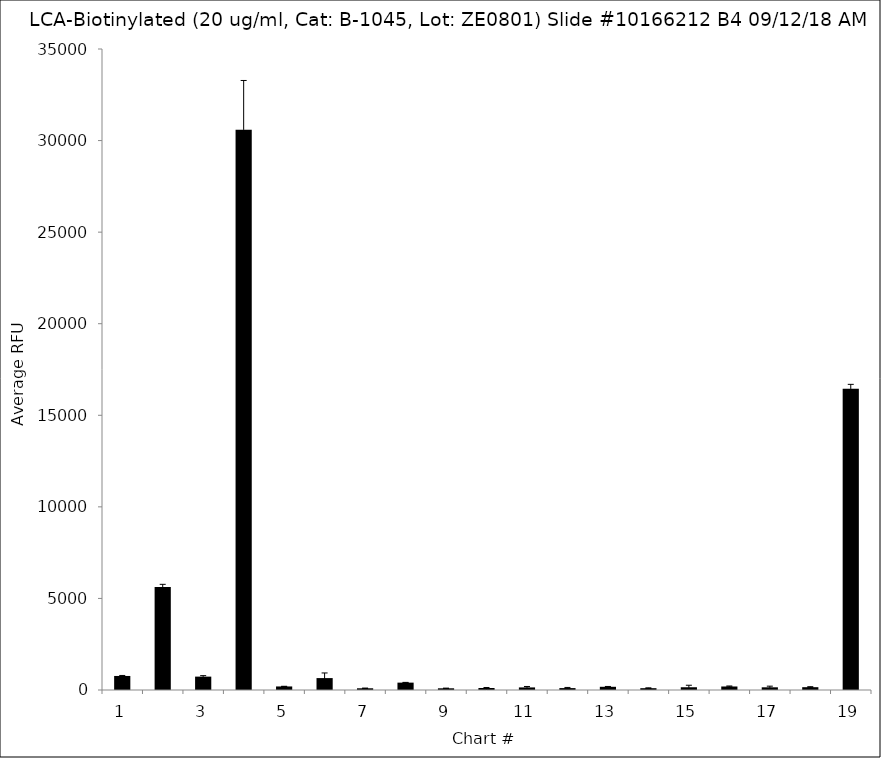
| Category | Series 0 |
|---|---|
| 1.0 | 766.5 |
| 2.0 | 5623 |
| 3.0 | 730.75 |
| 4.0 | 30585.75 |
| 5.0 | 193.75 |
| 6.0 | 650.5 |
| 7.0 | 94 |
| 8.0 | 402.5 |
| 9.0 | 93 |
| 10.0 | 108 |
| 11.0 | 140.75 |
| 12.0 | 104 |
| 13.0 | 175 |
| 14.0 | 99.25 |
| 15.0 | 150.5 |
| 16.0 | 192 |
| 17.0 | 147 |
| 18.0 | 153.75 |
| 19.0 | 16442.5 |